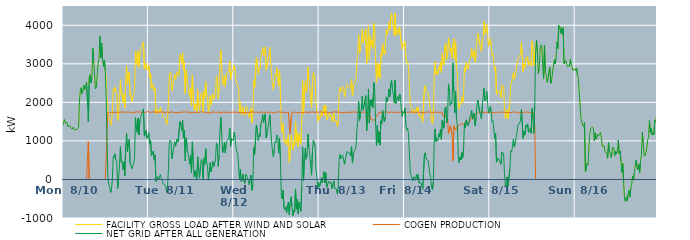
| Category | FACILITY GROSS LOAD AFTER WIND AND SOLAR | COGEN PRODUCTION | NET GRID AFTER ALL GENERATION |
|---|---|---|---|
|  Mon  8/10 | 1419 | 0 | 1419 |
|  Mon  8/10 | 1557 | 0 | 1557 |
|  Mon  8/10 | 1570 | 0 | 1570 |
|  Mon  8/10 | 1453 | 0 | 1453 |
|  Mon  8/10 | 1480 | 0 | 1480 |
|  Mon  8/10 | 1363 | 0 | 1363 |
|  Mon  8/10 | 1361 | 0 | 1361 |
|  Mon  8/10 | 1410 | 0 | 1410 |
|  Mon  8/10 | 1346 | 0 | 1346 |
|  Mon  8/10 | 1341 | 0 | 1341 |
|  Mon  8/10 | 1310 | 0 | 1310 |
|  Mon  8/10 | 1357 | 0 | 1357 |
|  Mon  8/10 | 1298 | 0 | 1298 |
|  Mon  8/10 | 1280 | 0 | 1280 |
|  Mon  8/10 | 1282 | 0 | 1282 |
|  Mon  8/10 | 1277 | 0 | 1277 |
|  Mon  8/10 | 1313 | 0 | 1313 |
|  Mon  8/10 | 1353 | 0 | 1353 |
|  Mon  8/10 | 2016 | 0 | 2016 |
|  Mon  8/10 | 2315 | 0 | 2315 |
|  Mon  8/10 | 2380 | 0 | 2380 |
|  Mon  8/10 | 2226 | 0 | 2226 |
|  Mon  8/10 | 2322 | 0 | 2322 |
|  Mon  8/10 | 2446 | 0 | 2446 |
|  Mon  8/10 | 2333 | 0 | 2333 |
|  Mon  8/10 | 2395 | 0 | 2395 |
|  Mon  8/10 | 2526 | 0 | 2526 |
|  Mon  8/10 | 2523 | 497 | 2026 |
|  Mon  8/10 | 2471 | 979 | 1492 |
|  Mon  8/10 | 2626 | 0 | 2626 |
|  Mon  8/10 | 2721 | 0 | 2721 |
|  Mon  8/10 | 2502 | 0 | 2502 |
|  Mon  8/10 | 2648 | 0 | 2648 |
|  Mon  8/10 | 3407 | 0 | 3407 |
|  Mon  8/10 | 3100 | 0 | 3100 |
|  Mon  8/10 | 3109 | 0 | 3109 |
|  Mon  8/10 | 2348 | 0 | 2348 |
|  Mon  8/10 | 2408 | 0 | 2408 |
|  Mon  8/10 | 2726 | 0 | 2726 |
|  Mon  8/10 | 2997 | 0 | 2997 |
|  Mon  8/10 | 3138 | 0 | 3138 |
|  Mon  8/10 | 3716 | 0 | 3716 |
|  Mon  8/10 | 3150 | 0 | 3150 |
|  Mon  8/10 | 3536 | 0 | 3536 |
|  Mon  8/10 | 3097 | 0 | 3097 |
|  Mon  8/10 | 2935 | 0 | 2935 |
|  Mon  8/10 | 3099 | 0 | 3099 |
|  Mon  8/10 | 2827 | 0 | 2827 |
|  Mon  8/10 | 2679 | 500 | 2179 |
|  Mon  8/10 | 2152 | 1245 | 907 |
|  Mon  8/10 | 1813 | 1745 | 68 |
|  Mon  8/10 | 1610 | 1745 | -135 |
|  Mon  8/10 | 1547 | 1737 | -190 |
|  Mon  8/10 | 1408 | 1748 | -340 |
|  Mon  8/10 | 1477 | 1742 | -265 |
|  Mon  8/10 | 1741 | 1747 | -6 |
|  Mon  8/10 | 2349 | 1742 | 607 |
|  Mon  8/10 | 2294 | 1727 | 567 |
|  Mon  8/10 | 2399 | 1732 | 667 |
|  Mon  8/10 | 2260 | 1746 | 514 |
|  Mon  8/10 | 2216 | 1745 | 471 |
|  Mon  8/10 | 1521 | 1757 | -236 |
|  Mon  8/10 | 1765 | 1737 | 28 |
|  Mon  8/10 | 2067 | 1722 | 345 |
|  Mon  8/10 | 2595 | 1743 | 852 |
|  Mon  8/10 | 2201 | 1752 | 449 |
|  Mon  8/10 | 2234 | 1756 | 478 |
|  Mon  8/10 | 1997 | 1739 | 258 |
|  Mon  8/10 | 2198 | 1742 | 456 |
|  Mon  8/10 | 1850 | 1755 | 95 |
|  Mon  8/10 | 2578 | 1743 | 835 |
|  Mon  8/10 | 2949 | 1751 | 1198 |
|  Mon  8/10 | 2464 | 1749 | 715 |
|  Mon  8/10 | 2679 | 1728 | 951 |
|  Mon  8/10 | 2789 | 1749 | 1040 |
|  Mon  8/10 | 2156 | 1728 | 428 |
|  Mon  8/10 | 2185 | 1736 | 449 |
|  Mon  8/10 | 2013 | 1739 | 274 |
|  Mon  8/10 | 2111 | 1740 | 371 |
|  Mon  8/10 | 2131 | 1730 | 401 |
|  Mon  8/10 | 2304 | 1727 | 577 |
|  Mon  8/10 | 3335 | 1731 | 1604 |
|  Mon  8/10 | 3059 | 1759 | 1300 |
|  Mon  8/10 | 2972 | 1749 | 1223 |
|  Mon  8/10 | 3337 | 1743 | 1594 |
|  Mon  8/10 | 2907 | 1750 | 1157 |
|  Mon  8/10 | 3302 | 1761 | 1541 |
|  Mon  8/10 | 3284 | 1730 | 1554 |
|  Mon  8/10 | 3445 | 1749 | 1696 |
|  Mon  8/10 | 3516 | 1744 | 1772 |
|  Mon  8/10 | 3571 | 1740 | 1831 |
|  Mon  8/10 | 2858 | 1737 | 1121 |
|  Mon  8/10 | 2857 | 1740 | 1117 |
|  Mon  8/10 | 3008 | 1740 | 1268 |
|  Mon  8/10 | 2836 | 1766 | 1070 |
|  Mon  8/10 | 2886 | 1761 | 1125 |
|  Tue  8/11 | 2956 | 1748 | 1208 |
|  Tue  8/11 | 2640 | 1727 | 913 |
|  Tue  8/11 | 2747 | 1741 | 1006 |
|  Tue  8/11 | 2351 | 1733 | 618 |
|  Tue  8/11 | 2383 | 1746 | 637 |
|  Tue  8/11 | 2472 | 1737 | 735 |
|  Tue  8/11 | 2289 | 1769 | 520 |
|  Tue  8/11 | 2365 | 1727 | 638 |
|  Tue  8/11 | 1693 | 1746 | -53 |
|  Tue  8/11 | 1679 | 1754 | -75 |
|  Tue  8/11 | 1819 | 1744 | 75 |
|  Tue  8/11 | 1723 | 1738 | -15 |
|  Tue  8/11 | 1750 | 1744 | 6 |
|  Tue  8/11 | 1877 | 1746 | 131 |
|  Tue  8/11 | 1756 | 1727 | 29 |
|  Tue  8/11 | 1752 | 1752 | 0 |
|  Tue  8/11 | 1640 | 1755 | -115 |
|  Tue  8/11 | 1634 | 1744 | -110 |
|  Tue  8/11 | 1614 | 1753 | -139 |
|  Tue  8/11 | 1545 | 1734 | -189 |
|  Tue  8/11 | 1423 | 1758 | -335 |
|  Tue  8/11 | 1550 | 1752 | -202 |
|  Tue  8/11 | 1949 | 1744 | 205 |
|  Tue  8/11 | 2656 | 1727 | 929 |
|  Tue  8/11 | 2781 | 1754 | 1027 |
|  Tue  8/11 | 2727 | 1743 | 984 |
|  Tue  8/11 | 2292 | 1752 | 540 |
|  Tue  8/11 | 2433 | 1748 | 685 |
|  Tue  8/11 | 2553 | 1736 | 817 |
|  Tue  8/11 | 2719 | 1739 | 980 |
|  Tue  8/11 | 2600 | 1735 | 865 |
|  Tue  8/11 | 2585 | 1745 | 840 |
|  Tue  8/11 | 2795 | 1743 | 1052 |
|  Tue  8/11 | 2738 | 1760 | 978 |
|  Tue  8/11 | 2698 | 1731 | 967 |
|  Tue  8/11 | 3239 | 1741 | 1498 |
|  Tue  8/11 | 3151 | 1743 | 1408 |
|  Tue  8/11 | 3015 | 1739 | 1276 |
|  Tue  8/11 | 3288 | 1746 | 1542 |
|  Tue  8/11 | 2832 | 1750 | 1082 |
|  Tue  8/11 | 3036 | 1755 | 1281 |
|  Tue  8/11 | 2226 | 1740 | 486 |
|  Tue  8/11 | 2828 | 1748 | 1080 |
|  Tue  8/11 | 2620 | 1740 | 880 |
|  Tue  8/11 | 2433 | 1746 | 687 |
|  Tue  8/11 | 2303 | 1744 | 559 |
|  Tue  8/11 | 2137 | 1741 | 396 |
|  Tue  8/11 | 2374 | 1743 | 631 |
|  Tue  8/11 | 1914 | 1734 | 180 |
|  Tue  8/11 | 2713 | 1735 | 978 |
|  Tue  8/11 | 2179 | 1747 | 432 |
|  Tue  8/11 | 1799 | 1739 | 60 |
|  Tue  8/11 | 1965 | 1735 | 230 |
|  Tue  8/11 | 1967 | 1742 | 225 |
|  Tue  8/11 | 1744 | 1746 | -2 |
|  Tue  8/11 | 2332 | 1746 | 586 |
|  Tue  8/11 | 2026 | 1734 | 292 |
|  Tue  8/11 | 1793 | 1752 | 41 |
|  Tue  8/11 | 2073 | 1753 | 320 |
|  Tue  8/11 | 2249 | 1736 | 513 |
|  Tue  8/11 | 2194 | 1750 | 444 |
|  Tue  8/11 | 1738 | 1741 | -3 |
|  Tue  8/11 | 2297 | 1750 | 547 |
|  Tue  8/11 | 2119 | 1727 | 392 |
|  Tue  8/11 | 2534 | 1737 | 797 |
|  Tue  8/11 | 2203 | 1746 | 457 |
|  Tue  8/11 | 2095 | 1739 | 356 |
|  Tue  8/11 | 1729 | 1748 | -19 |
|  Tue  8/11 | 1919 | 1728 | 191 |
|  Tue  8/11 | 2176 | 1738 | 438 |
|  Tue  8/11 | 1933 | 1739 | 194 |
|  Tue  8/11 | 2076 | 1761 | 315 |
|  Tue  8/11 | 2219 | 1754 | 465 |
|  Tue  8/11 | 2080 | 1748 | 332 |
|  Tue  8/11 | 2133 | 1745 | 388 |
|  Tue  8/11 | 2238 | 1723 | 515 |
|  Tue  8/11 | 2684 | 1736 | 948 |
|  Tue  8/11 | 2621 | 1739 | 882 |
|  Tue  8/11 | 2091 | 1752 | 339 |
|  Tue  8/11 | 2380 | 1754 | 626 |
|  Tue  8/11 | 3011 | 1735 | 1276 |
|  Tue  8/11 | 3356 | 1745 | 1611 |
|  Tue  8/11 | 2865 | 1720 | 1145 |
|  Tue  8/11 | 2444 | 1748 | 696 |
|  Tue  8/11 | 2547 | 1753 | 794 |
|  Tue  8/11 | 2708 | 1749 | 959 |
|  Tue  8/11 | 2413 | 1727 | 686 |
|  Tue  8/11 | 2688 | 1743 | 945 |
|  Tue  8/11 | 2758 | 1746 | 1012 |
|  Tue  8/11 | 2755 | 1741 | 1014 |
|  Tue  8/11 | 2830 | 1753 | 1077 |
|  Tue  8/11 | 3075 | 1742 | 1333 |
|  Tue  8/11 | 2594 | 1731 | 863 |
|  Tue  8/11 | 2799 | 1735 | 1064 |
|  Tue  8/11 | 2773 | 1738 | 1035 |
|  Tue  8/11 | 2755 | 1751 | 1004 |
|  Wed  8/12 | 2965 | 1742 | 1223 |
|  Wed  8/12 | 2831 | 1737 | 1094 |
|  Wed  8/12 | 2580 | 1743 | 837 |
|  Wed  8/12 | 2474 | 1750 | 724 |
|  Wed  8/12 | 2425 | 1761 | 664 |
|  Wed  8/12 | 2383 | 1732 | 651 |
|  Wed  8/12 | 1761 | 1749 | 12 |
|  Wed  8/12 | 1997 | 1739 | 258 |
|  Wed  8/12 | 1680 | 1740 | -60 |
|  Wed  8/12 | 1721 | 1737 | -16 |
|  Wed  8/12 | 1872 | 1740 | 132 |
|  Wed  8/12 | 1681 | 1731 | -50 |
|  Wed  8/12 | 1646 | 1747 | -101 |
|  Wed  8/12 | 1874 | 1735 | 139 |
|  Wed  8/12 | 1904 | 1745 | 159 |
|  Wed  8/12 | 1783 | 1738 | 45 |
|  Wed  8/12 | 1769 | 1728 | 41 |
|  Wed  8/12 | 1599 | 1742 | -143 |
|  Wed  8/12 | 1580 | 1741 | -161 |
|  Wed  8/12 | 1852 | 1742 | 110 |
|  Wed  8/12 | 1466 | 1746 | -280 |
|  Wed  8/12 | 1609 | 1759 | -150 |
|  Wed  8/12 | 2560 | 1734 | 826 |
|  Wed  8/12 | 2392 | 1739 | 653 |
|  Wed  8/12 | 2394 | 1742 | 652 |
|  Wed  8/12 | 3170 | 1755 | 1415 |
|  Wed  8/12 | 3013 | 1735 | 1278 |
|  Wed  8/12 | 2734 | 1730 | 1004 |
|  Wed  8/12 | 2893 | 1728 | 1165 |
|  Wed  8/12 | 2862 | 1746 | 1116 |
|  Wed  8/12 | 3164 | 1732 | 1432 |
|  Wed  8/12 | 3280 | 1750 | 1530 |
|  Wed  8/12 | 3425 | 1738 | 1687 |
|  Wed  8/12 | 3216 | 1739 | 1477 |
|  Wed  8/12 | 3245 | 1762 | 1483 |
|  Wed  8/12 | 3443 | 1742 | 1701 |
|  Wed  8/12 | 2834 | 1757 | 1077 |
|  Wed  8/12 | 2919 | 1742 | 1177 |
|  Wed  8/12 | 2907 | 1748 | 1159 |
|  Wed  8/12 | 3226 | 1741 | 1485 |
|  Wed  8/12 | 3421 | 1742 | 1679 |
|  Wed  8/12 | 3098 | 1746 | 1352 |
|  Wed  8/12 | 2714 | 1724 | 990 |
|  Wed  8/12 | 2494 | 1739 | 755 |
|  Wed  8/12 | 2324 | 1734 | 590 |
|  Wed  8/12 | 2489 | 1727 | 762 |
|  Wed  8/12 | 2734 | 1741 | 993 |
|  Wed  8/12 | 2687 | 1731 | 956 |
|  Wed  8/12 | 2899 | 1741 | 1158 |
|  Wed  8/12 | 2890 | 1760 | 1130 |
|  Wed  8/12 | 2426 | 1736 | 690 |
|  Wed  8/12 | 2824 | 1748 | 1076 |
|  Wed  8/12 | 2290 | 1753 | 537 |
|  Wed  8/12 | 1322 | 1745 | -423 |
|  Wed  8/12 | 1219 | 1727 | -508 |
|  Wed  8/12 | 1460 | 1742 | -282 |
|  Wed  8/12 | 1031 | 1753 | -722 |
|  Wed  8/12 | 946 | 1736 | -790 |
|  Wed  8/12 | 1021 | 1730 | -709 |
|  Wed  8/12 | 874 | 1731 | -857 |
|  Wed  8/12 | 1058 | 1733 | -675 |
|  Wed  8/12 | 1162 | 1747 | -585 |
|  Wed  8/12 | 445 | 1362 | -917 |
|  Wed  8/12 | 597 | 1193 | -596 |
|  Wed  8/12 | 1154 | 1601 | -447 |
|  Wed  8/12 | 1041 | 1731 | -690 |
|  Wed  8/12 | 764 | 1708 | -944 |
|  Wed  8/12 | 952 | 1743 | -791 |
|  Wed  8/12 | 889 | 1737 | -848 |
|  Wed  8/12 | 1508 | 1752 | -244 |
|  Wed  8/12 | 950 | 1721 | -771 |
|  Wed  8/12 | 1225 | 1740 | -515 |
|  Wed  8/12 | 852 | 1736 | -884 |
|  Wed  8/12 | 1166 | 1749 | -583 |
|  Wed  8/12 | 1009 | 1743 | -734 |
|  Wed  8/12 | 909 | 1737 | -828 |
|  Wed  8/12 | 1552 | 1740 | -188 |
|  Wed  8/12 | 2563 | 1722 | 841 |
|  Wed  8/12 | 1686 | 1720 | -34 |
|  Wed  8/12 | 2299 | 1746 | 553 |
|  Wed  8/12 | 2550 | 1740 | 810 |
|  Wed  8/12 | 2272 | 1748 | 524 |
|  Wed  8/12 | 2389 | 1739 | 650 |
|  Wed  8/12 | 2913 | 1731 | 1182 |
|  Wed  8/12 | 2589 | 1755 | 834 |
|  Wed  8/12 | 2401 | 1750 | 651 |
|  Wed  8/12 | 2092 | 1727 | 365 |
|  Wed  8/12 | 1857 | 1746 | 111 |
|  Wed  8/12 | 2464 | 1744 | 720 |
|  Wed  8/12 | 2773 | 1754 | 1019 |
|  Wed  8/12 | 2785 | 1757 | 1028 |
|  Wed  8/12 | 2602 | 1736 | 866 |
|  Wed  8/12 | 1998 | 1748 | 250 |
|  Wed  8/12 | 1828 | 1749 | 79 |
|  Wed  8/12 | 1500 | 1742 | -242 |
|  Wed  8/12 | 1665 | 1744 | -79 |
|  Thu  8/13 | 1560 | 1750 | -190 |
|  Thu  8/13 | 1616 | 1752 | -136 |
|  Thu  8/13 | 1778 | 1734 | 44 |
|  Thu  8/13 | 1663 | 1753 | -90 |
|  Thu  8/13 | 1773 | 1730 | 43 |
|  Thu  8/13 | 1926 | 1725 | 201 |
|  Thu  8/13 | 1665 | 1753 | -88 |
|  Thu  8/13 | 1922 | 1748 | 174 |
|  Thu  8/13 | 1544 | 1747 | -203 |
|  Thu  8/13 | 1592 | 1742 | -150 |
|  Thu  8/13 | 1689 | 1731 | -42 |
|  Thu  8/13 | 1727 | 1746 | -19 |
|  Thu  8/13 | 1632 | 1742 | -110 |
|  Thu  8/13 | 1674 | 1745 | -71 |
|  Thu  8/13 | 1497 | 1736 | -239 |
|  Thu  8/13 | 1603 | 1738 | -135 |
|  Thu  8/13 | 1720 | 1756 | -36 |
|  Thu  8/13 | 1509 | 1742 | -233 |
|  Thu  8/13 | 1527 | 1754 | -227 |
|  Thu  8/13 | 1522 | 1766 | -244 |
|  Thu  8/13 | 1364 | 1745 | -381 |
|  Thu  8/13 | 1516 | 1750 | -234 |
|  Thu  8/13 | 2248 | 1746 | 502 |
|  Thu  8/13 | 2398 | 1752 | 646 |
|  Thu  8/13 | 2274 | 1736 | 538 |
|  Thu  8/13 | 2336 | 1749 | 587 |
|  Thu  8/13 | 2369 | 1733 | 636 |
|  Thu  8/13 | 2412 | 1754 | 658 |
|  Thu  8/13 | 2135 | 1740 | 395 |
|  Thu  8/13 | 2264 | 1751 | 513 |
|  Thu  8/13 | 2261 | 1733 | 528 |
|  Thu  8/13 | 2478 | 1750 | 728 |
|  Thu  8/13 | 2432 | 1742 | 690 |
|  Thu  8/13 | 2395 | 1729 | 666 |
|  Thu  8/13 | 2414 | 1741 | 673 |
|  Thu  8/13 | 2355 | 1747 | 608 |
|  Thu  8/13 | 2606 | 1748 | 858 |
|  Thu  8/13 | 2166 | 1742 | 424 |
|  Thu  8/13 | 2410 | 1748 | 662 |
|  Thu  8/13 | 2468 | 1745 | 723 |
|  Thu  8/13 | 2475 | 1748 | 727 |
|  Thu  8/13 | 2574 | 1740 | 834 |
|  Thu  8/13 | 3044 | 1746 | 1298 |
|  Thu  8/13 | 3240 | 1735 | 1505 |
|  Thu  8/13 | 3758 | 1739 | 2019 |
|  Thu  8/13 | 3277 | 1742 | 1535 |
|  Thu  8/13 | 3413 | 1733 | 1680 |
|  Thu  8/13 | 3561 | 1735 | 1826 |
|  Thu  8/13 | 3906 | 1747 | 2159 |
|  Thu  8/13 | 3546 | 1741 | 1805 |
|  Thu  8/13 | 3642 | 1750 | 1892 |
|  Thu  8/13 | 3812 | 1738 | 2074 |
|  Thu  8/13 | 3911 | 1733 | 2178 |
|  Thu  8/13 | 3008 | 1742 | 1266 |
|  Thu  8/13 | 3397 | 1737 | 1660 |
|  Thu  8/13 | 3990 | 1641 | 2349 |
|  Thu  8/13 | 3111 | 1648 | 1463 |
|  Thu  8/13 | 3703 | 1641 | 2062 |
|  Thu  8/13 | 3459 | 1548 | 1911 |
|  Thu  8/13 | 3621 | 1541 | 2080 |
|  Thu  8/13 | 3402 | 1543 | 1859 |
|  Thu  8/13 | 4055 | 1545 | 2510 |
|  Thu  8/13 | 3873 | 1538 | 2335 |
|  Thu  8/13 | 3064 | 1581 | 1483 |
|  Thu  8/13 | 2503 | 1635 | 868 |
|  Thu  8/13 | 3033 | 1634 | 1399 |
|  Thu  8/13 | 2659 | 1704 | 955 |
|  Thu  8/13 | 2990 | 1752 | 1238 |
|  Thu  8/13 | 2621 | 1730 | 891 |
|  Thu  8/13 | 3261 | 1736 | 1525 |
|  Thu  8/13 | 3198 | 1753 | 1445 |
|  Thu  8/13 | 3525 | 1738 | 1787 |
|  Thu  8/13 | 3530 | 1723 | 1807 |
|  Thu  8/13 | 3234 | 1743 | 1491 |
|  Thu  8/13 | 3364 | 1737 | 1627 |
|  Thu  8/13 | 3898 | 1756 | 2142 |
|  Thu  8/13 | 3768 | 1756 | 2012 |
|  Thu  8/13 | 3850 | 1741 | 2109 |
|  Thu  8/13 | 4073 | 1734 | 2339 |
|  Thu  8/13 | 3882 | 1740 | 2142 |
|  Thu  8/13 | 4198 | 1730 | 2468 |
|  Thu  8/13 | 4324 | 1752 | 2572 |
|  Thu  8/13 | 4096 | 1756 | 2340 |
|  Thu  8/13 | 3948 | 1743 | 2205 |
|  Thu  8/13 | 3741 | 1748 | 1993 |
|  Thu  8/13 | 4313 | 1742 | 2571 |
|  Thu  8/13 | 3727 | 1755 | 1972 |
|  Thu  8/13 | 3837 | 1745 | 2092 |
|  Thu  8/13 | 3906 | 1754 | 2152 |
|  Thu  8/13 | 3768 | 1734 | 2034 |
|  Thu  8/13 | 3947 | 1729 | 2218 |
|  Thu  8/13 | 3935 | 1746 | 2189 |
|  Thu  8/13 | 3542 | 1740 | 1802 |
|  Thu  8/13 | 3376 | 1741 | 1635 |
|  Thu  8/13 | 3522 | 1758 | 1764 |
|  Thu  8/13 | 3460 | 1733 | 1727 |
|  Fri  8/14 | 3594 | 1739 | 1855 |
|  Fri  8/14 | 3162 | 1746 | 1416 |
|  Fri  8/14 | 3024 | 1740 | 1284 |
|  Fri  8/14 | 3060 | 1739 | 1321 |
|  Fri  8/14 | 2923 | 1729 | 1194 |
|  Fri  8/14 | 2439 | 1750 | 689 |
|  Fri  8/14 | 1956 | 1757 | 199 |
|  Fri  8/14 | 1856 | 1745 | 111 |
|  Fri  8/14 | 1783 | 1740 | 43 |
|  Fri  8/14 | 1710 | 1749 | -39 |
|  Fri  8/14 | 1811 | 1746 | 65 |
|  Fri  8/14 | 1776 | 1741 | 35 |
|  Fri  8/14 | 1718 | 1740 | -22 |
|  Fri  8/14 | 1870 | 1739 | 131 |
|  Fri  8/14 | 1761 | 1740 | 21 |
|  Fri  8/14 | 1879 | 1757 | 122 |
|  Fri  8/14 | 1632 | 1729 | -97 |
|  Fri  8/14 | 1647 | 1735 | -88 |
|  Fri  8/14 | 1669 | 1747 | -78 |
|  Fri  8/14 | 1580 | 1744 | -164 |
|  Fri  8/14 | 1482 | 1738 | -256 |
|  Fri  8/14 | 1503 | 1749 | -246 |
|  Fri  8/14 | 2391 | 1727 | 664 |
|  Fri  8/14 | 2440 | 1745 | 695 |
|  Fri  8/14 | 2278 | 1746 | 532 |
|  Fri  8/14 | 2266 | 1750 | 516 |
|  Fri  8/14 | 2233 | 1748 | 485 |
|  Fri  8/14 | 2098 | 1749 | 349 |
|  Fri  8/14 | 1898 | 1755 | 143 |
|  Fri  8/14 | 1783 | 1735 | 48 |
|  Fri  8/14 | 1518 | 1731 | -213 |
|  Fri  8/14 | 1445 | 1719 | -274 |
|  Fri  8/14 | 1661 | 1729 | -68 |
|  Fri  8/14 | 2733 | 1734 | 999 |
|  Fri  8/14 | 3055 | 1744 | 1311 |
|  Fri  8/14 | 2722 | 1736 | 986 |
|  Fri  8/14 | 2803 | 1748 | 1055 |
|  Fri  8/14 | 2732 | 1731 | 1001 |
|  Fri  8/14 | 2909 | 1736 | 1173 |
|  Fri  8/14 | 2838 | 1738 | 1100 |
|  Fri  8/14 | 3037 | 1745 | 1292 |
|  Fri  8/14 | 2773 | 1740 | 1033 |
|  Fri  8/14 | 3273 | 1739 | 1534 |
|  Fri  8/14 | 3103 | 1633 | 1470 |
|  Fri  8/14 | 2968 | 1640 | 1328 |
|  Fri  8/14 | 3459 | 1631 | 1828 |
|  Fri  8/14 | 3535 | 1653 | 1882 |
|  Fri  8/14 | 3114 | 1643 | 1471 |
|  Fri  8/14 | 3154 | 1565 | 1589 |
|  Fri  8/14 | 3677 | 1196 | 2481 |
|  Fri  8/14 | 3528 | 1277 | 2251 |
|  Fri  8/14 | 3307 | 1392 | 1915 |
|  Fri  8/14 | 3401 | 1389 | 2012 |
|  Fri  8/14 | 3153 | 1180 | 1973 |
|  Fri  8/14 | 3504 | 484 | 3020 |
|  Fri  8/14 | 3667 | 1391 | 2276 |
|  Fri  8/14 | 3114 | 1379 | 1735 |
|  Fri  8/14 | 3571 | 1281 | 2290 |
|  Fri  8/14 | 2867 | 1284 | 1583 |
|  Fri  8/14 | 2794 | 1387 | 1407 |
|  Fri  8/14 | 2028 | 1394 | 634 |
|  Fri  8/14 | 1829 | 1398 | 431 |
|  Fri  8/14 | 1984 | 1401 | 583 |
|  Fri  8/14 | 1953 | 1444 | 509 |
|  Fri  8/14 | 2137 | 1445 | 692 |
|  Fri  8/14 | 1992 | 1431 | 561 |
|  Fri  8/14 | 2256 | 1445 | 811 |
|  Fri  8/14 | 2897 | 1437 | 1460 |
|  Fri  8/14 | 2786 | 1448 | 1338 |
|  Fri  8/14 | 3038 | 1493 | 1545 |
|  Fri  8/14 | 3041 | 1492 | 1549 |
|  Fri  8/14 | 2868 | 1476 | 1392 |
|  Fri  8/14 | 2951 | 1492 | 1459 |
|  Fri  8/14 | 3116 | 1497 | 1619 |
|  Fri  8/14 | 3187 | 1510 | 1677 |
|  Fri  8/14 | 3407 | 1613 | 1794 |
|  Fri  8/14 | 3162 | 1599 | 1563 |
|  Fri  8/14 | 3247 | 1586 | 1661 |
|  Fri  8/14 | 3360 | 1636 | 1724 |
|  Fri  8/14 | 3042 | 1653 | 1389 |
|  Fri  8/14 | 3265 | 1681 | 1584 |
|  Fri  8/14 | 3635 | 1702 | 1933 |
|  Fri  8/14 | 3791 | 1737 | 2054 |
|  Fri  8/14 | 3791 | 1740 | 2051 |
|  Fri  8/14 | 3512 | 1755 | 1757 |
|  Fri  8/14 | 3416 | 1730 | 1686 |
|  Fri  8/14 | 3322 | 1750 | 1572 |
|  Fri  8/14 | 3636 | 1734 | 1902 |
|  Fri  8/14 | 3662 | 1741 | 1921 |
|  Fri  8/14 | 4103 | 1736 | 2367 |
|  Fri  8/14 | 3780 | 1737 | 2043 |
|  Fri  8/14 | 3847 | 1756 | 2091 |
|  Fri  8/14 | 4028 | 1746 | 2282 |
|  Fri  8/14 | 3766 | 1757 | 2009 |
|  Fri  8/14 | 3450 | 1729 | 1721 |
|  Fri  8/14 | 3565 | 1748 | 1817 |
|  Sat  8/15 | 3649 | 1744 | 1905 |
|  Sat  8/15 | 3505 | 1747 | 1758 |
|  Sat  8/15 | 3214 | 1725 | 1489 |
|  Sat  8/15 | 3261 | 1735 | 1526 |
|  Sat  8/15 | 3047 | 1741 | 1306 |
|  Sat  8/15 | 2817 | 1745 | 1072 |
|  Sat  8/15 | 2918 | 1724 | 1194 |
|  Sat  8/15 | 2199 | 1750 | 449 |
|  Sat  8/15 | 2187 | 1745 | 442 |
|  Sat  8/15 | 2289 | 1732 | 557 |
|  Sat  8/15 | 2265 | 1748 | 517 |
|  Sat  8/15 | 2290 | 1752 | 538 |
|  Sat  8/15 | 2129 | 1739 | 390 |
|  Sat  8/15 | 2447 | 1738 | 709 |
|  Sat  8/15 | 2451 | 1738 | 713 |
|  Sat  8/15 | 2423 | 1753 | 670 |
|  Sat  8/15 | 1865 | 1736 | 129 |
|  Sat  8/15 | 1579 | 1738 | -159 |
|  Sat  8/15 | 1556 | 1743 | -187 |
|  Sat  8/15 | 1804 | 1737 | 67 |
|  Sat  8/15 | 1575 | 1751 | -176 |
|  Sat  8/15 | 1577 | 1742 | -165 |
|  Sat  8/15 | 2002 | 1735 | 267 |
|  Sat  8/15 | 2470 | 1729 | 741 |
|  Sat  8/15 | 2459 | 1745 | 714 |
|  Sat  8/15 | 2598 | 1748 | 850 |
|  Sat  8/15 | 2793 | 1742 | 1051 |
|  Sat  8/15 | 2604 | 1752 | 852 |
|  Sat  8/15 | 2669 | 1742 | 927 |
|  Sat  8/15 | 2678 | 1726 | 952 |
|  Sat  8/15 | 2976 | 1763 | 1213 |
|  Sat  8/15 | 3130 | 1735 | 1395 |
|  Sat  8/15 | 3134 | 1743 | 1391 |
|  Sat  8/15 | 3194 | 1726 | 1468 |
|  Sat  8/15 | 3276 | 1741 | 1535 |
|  Sat  8/15 | 3552 | 1741 | 1811 |
|  Sat  8/15 | 3535 | 1745 | 1790 |
|  Sat  8/15 | 2806 | 1741 | 1065 |
|  Sat  8/15 | 2981 | 1737 | 1244 |
|  Sat  8/15 | 2899 | 1748 | 1151 |
|  Sat  8/15 | 3148 | 1743 | 1405 |
|  Sat  8/15 | 3114 | 1748 | 1366 |
|  Sat  8/15 | 3195 | 1753 | 1442 |
|  Sat  8/15 | 2965 | 1746 | 1219 |
|  Sat  8/15 | 2998 | 1738 | 1260 |
|  Sat  8/15 | 3063 | 1737 | 1326 |
|  Sat  8/15 | 2941 | 1740 | 1201 |
|  Sat  8/15 | 3587 | 1748 | 1839 |
|  Sat  8/15 | 3388 | 1765 | 1623 |
|  Sat  8/15 | 2947 | 1749 | 1198 |
|  Sat  8/15 | 3311 | 1401 | 1910 |
|  Sat  8/15 | 3301 | 0 | 3301 |
|  Sat  8/15 | 3616 | 0 | 3616 |
|  Sat  8/15 | 3280 | 0 | 3280 |
|  Sat  8/15 | 2741 | 0 | 2741 |
|  Sat  8/15 | 2879 | 0 | 2879 |
|  Sat  8/15 | 3362 | 0 | 3362 |
|  Sat  8/15 | 3494 | 0 | 3494 |
|  Sat  8/15 | 3459 | 0 | 3459 |
|  Sat  8/15 | 2928 | 0 | 2928 |
|  Sat  8/15 | 2604 | 0 | 2604 |
|  Sat  8/15 | 3478 | 0 | 3478 |
|  Sat  8/15 | 2770 | 0 | 2770 |
|  Sat  8/15 | 2717 | 0 | 2717 |
|  Sat  8/15 | 2518 | 0 | 2518 |
|  Sat  8/15 | 2607 | 0 | 2607 |
|  Sat  8/15 | 2838 | 0 | 2838 |
|  Sat  8/15 | 2910 | 0 | 2910 |
|  Sat  8/15 | 2492 | 0 | 2492 |
|  Sat  8/15 | 2587 | 0 | 2587 |
|  Sat  8/15 | 2761 | 0 | 2761 |
|  Sat  8/15 | 2770 | 0 | 2770 |
|  Sat  8/15 | 3101 | 0 | 3101 |
|  Sat  8/15 | 2997 | 0 | 2997 |
|  Sat  8/15 | 3147 | 0 | 3147 |
|  Sat  8/15 | 3563 | 0 | 3563 |
|  Sat  8/15 | 3395 | 0 | 3395 |
|  Sat  8/15 | 3998 | 0 | 3998 |
|  Sat  8/15 | 3972 | 0 | 3972 |
|  Sat  8/15 | 3794 | 0 | 3794 |
|  Sat  8/15 | 3937 | 0 | 3937 |
|  Sat  8/15 | 3762 | 0 | 3762 |
|  Sat  8/15 | 3936 | 0 | 3936 |
|  Sat  8/15 | 2997 | 0 | 2997 |
|  Sat  8/15 | 3042 | 0 | 3042 |
|  Sat  8/15 | 3093 | 0 | 3093 |
|  Sat  8/15 | 2981 | 0 | 2981 |
|  Sat  8/15 | 2922 | 0 | 2922 |
|  Sat  8/15 | 2957 | 0 | 2957 |
|  Sat  8/15 | 2929 | 0 | 2929 |
|  Sat  8/15 | 3123 | 0 | 3123 |
|  Sat  8/15 | 2978 | 0 | 2978 |
|  Sat  8/15 | 2906 | 0 | 2906 |
|  Sat  8/15 | 2822 | 0 | 2822 |
|  Sat  8/15 | 2818 | 0 | 2818 |
|  Sat  8/15 | 2874 | 0 | 2874 |
|  Sun  8/16 | 2818 | 0 | 2818 |
|  Sun  8/16 | 2895 | 0 | 2895 |
|  Sun  8/16 | 2718 | 0 | 2718 |
|  Sun  8/16 | 2623 | 0 | 2623 |
|  Sun  8/16 | 2287 | 0 | 2287 |
|  Sun  8/16 | 1949 | 0 | 1949 |
|  Sun  8/16 | 1588 | 0 | 1588 |
|  Sun  8/16 | 1593 | 0 | 1593 |
|  Sun  8/16 | 1393 | 0 | 1393 |
|  Sun  8/16 | 1365 | 0 | 1365 |
|  Sun  8/16 | 1475 | 0 | 1475 |
|  Sun  8/16 | 192 | 0 | 192 |
|  Sun  8/16 | 189 | 0 | 189 |
|  Sun  8/16 | 414 | 0 | 414 |
|  Sun  8/16 | 386 | 0 | 386 |
|  Sun  8/16 | 881 | 0 | 881 |
|  Sun  8/16 | 1193 | 0 | 1193 |
|  Sun  8/16 | 1328 | 0 | 1328 |
|  Sun  8/16 | 1325 | 0 | 1325 |
|  Sun  8/16 | 1356 | 0 | 1356 |
|  Sun  8/16 | 1305 | 0 | 1305 |
|  Sun  8/16 | 1006 | 0 | 1006 |
|  Sun  8/16 | 1212 | 0 | 1212 |
|  Sun  8/16 | 1045 | 0 | 1045 |
|  Sun  8/16 | 1023 | 0 | 1023 |
|  Sun  8/16 | 1171 | 0 | 1171 |
|  Sun  8/16 | 1139 | 0 | 1139 |
|  Sun  8/16 | 1128 | 0 | 1128 |
|  Sun  8/16 | 1219 | 0 | 1219 |
|  Sun  8/16 | 1064 | 0 | 1064 |
|  Sun  8/16 | 852 | 0 | 852 |
|  Sun  8/16 | 858 | 0 | 858 |
|  Sun  8/16 | 874 | 0 | 874 |
|  Sun  8/16 | 735 | 0 | 735 |
|  Sun  8/16 | 721 | 0 | 721 |
|  Sun  8/16 | 675 | 0 | 675 |
|  Sun  8/16 | 548 | 0 | 548 |
|  Sun  8/16 | 957 | 0 | 957 |
|  Sun  8/16 | 710 | 0 | 710 |
|  Sun  8/16 | 675 | 0 | 675 |
|  Sun  8/16 | 564 | 0 | 564 |
|  Sun  8/16 | 726 | 0 | 726 |
|  Sun  8/16 | 845 | 0 | 845 |
|  Sun  8/16 | 808 | 0 | 808 |
|  Sun  8/16 | 617 | 0 | 617 |
|  Sun  8/16 | 733 | 0 | 733 |
|  Sun  8/16 | 660 | 0 | 660 |
|  Sun  8/16 | 713 | 0 | 713 |
|  Sun  8/16 | 1023 | 0 | 1023 |
|  Sun  8/16 | 671 | 0 | 671 |
|  Sun  8/16 | 737 | 0 | 737 |
|  Sun  8/16 | 471 | 0 | 471 |
|  Sun  8/16 | 184 | 0 | 184 |
|  Sun  8/16 | 415 | 0 | 415 |
|  Sun  8/16 | -74 | 0 | -74 |
|  Sun  8/16 | -507 | 0 | -507 |
|  Sun  8/16 | -573 | 0 | -573 |
|  Sun  8/16 | -453 | 0 | -453 |
|  Sun  8/16 | -555 | 0 | -555 |
|  Sun  8/16 | -376 | 0 | -376 |
|  Sun  8/16 | -286 | 0 | -286 |
|  Sun  8/16 | -458 | 0 | -458 |
|  Sun  8/16 | -226 | 0 | -226 |
|  Sun  8/16 | -128 | 0 | -128 |
|  Sun  8/16 | 84 | 0 | 84 |
|  Sun  8/16 | -16 | 0 | -16 |
|  Sun  8/16 | 163 | 0 | 163 |
|  Sun  8/16 | 343 | 0 | 343 |
|  Sun  8/16 | 503 | 0 | 503 |
|  Sun  8/16 | 322 | 0 | 322 |
|  Sun  8/16 | 251 | 0 | 251 |
|  Sun  8/16 | 404 | 0 | 404 |
|  Sun  8/16 | 177 | 0 | 177 |
|  Sun  8/16 | 471 | 0 | 471 |
|  Sun  8/16 | 645 | 0 | 645 |
|  Sun  8/16 | 1231 | 0 | 1231 |
|  Sun  8/16 | 942 | 0 | 942 |
|  Sun  8/16 | 639 | 0 | 639 |
|  Sun  8/16 | 606 | 0 | 606 |
|  Sun  8/16 | 697 | 0 | 697 |
|  Sun  8/16 | 817 | 0 | 817 |
|  Sun  8/16 | 1030 | 0 | 1030 |
|  Sun  8/16 | 1091 | 0 | 1091 |
|  Sun  8/16 | 1526 | 0 | 1526 |
|  Sun  8/16 | 1222 | 0 | 1222 |
|  Sun  8/16 | 1329 | 0 | 1329 |
|  Sun  8/16 | 1158 | 0 | 1158 |
|  Sun  8/16 | 1215 | 0 | 1215 |
|  Sun  8/16 | 1153 | 0 | 1153 |
|  Sun  8/16 | 1532 | 0 | 1532 |
|  Sun  8/16 | 1499 | 0 | 1499 |
|  Sun  8/16 | 1669 | 0 | 1669 |